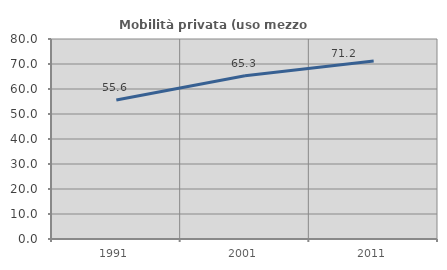
| Category | Mobilità privata (uso mezzo privato) |
|---|---|
| 1991.0 | 55.633 |
| 2001.0 | 65.267 |
| 2011.0 | 71.231 |